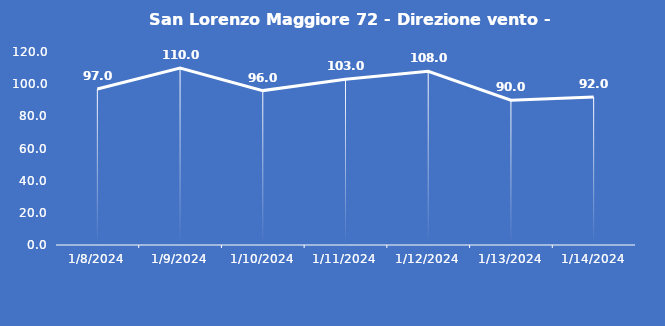
| Category | San Lorenzo Maggiore 72 - Direzione vento - Grezzo (°N) |
|---|---|
| 1/8/24 | 97 |
| 1/9/24 | 110 |
| 1/10/24 | 96 |
| 1/11/24 | 103 |
| 1/12/24 | 108 |
| 1/13/24 | 90 |
| 1/14/24 | 92 |